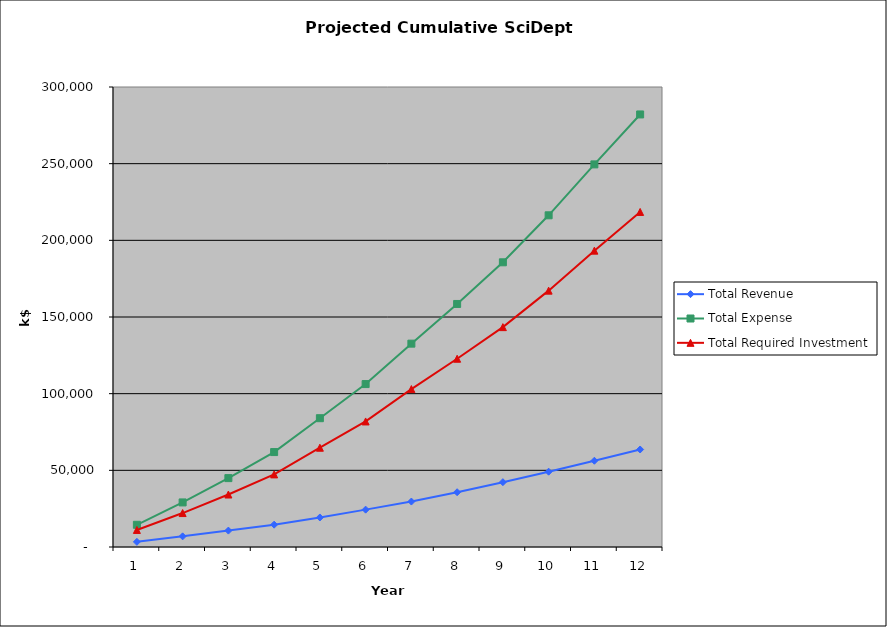
| Category | Total Revenue | Total Expense | Total Required Investment |
|---|---|---|---|
| 0 | 3361.515 | 14483.226 | 11121.71 |
| 1 | 6935.473 | 29070.937 | 22135.464 |
| 2 | 10694.474 | 44919.916 | 34225.442 |
| 3 | 14565.33 | 61913.923 | 47348.592 |
| 4 | 19255.746 | 84000.497 | 64744.75 |
| 5 | 24371.458 | 106259.907 | 81888.449 |
| 6 | 29633.252 | 132621.296 | 102988.044 |
| 7 | 35723.515 | 158503.522 | 122780.007 |
| 8 | 42282.822 | 185671.219 | 143388.397 |
| 9 | 49122.67 | 216319.853 | 167197.183 |
| 10 | 56255 | 249524.122 | 193269.123 |
| 11 | 63588.976 | 282097.879 | 218508.903 |